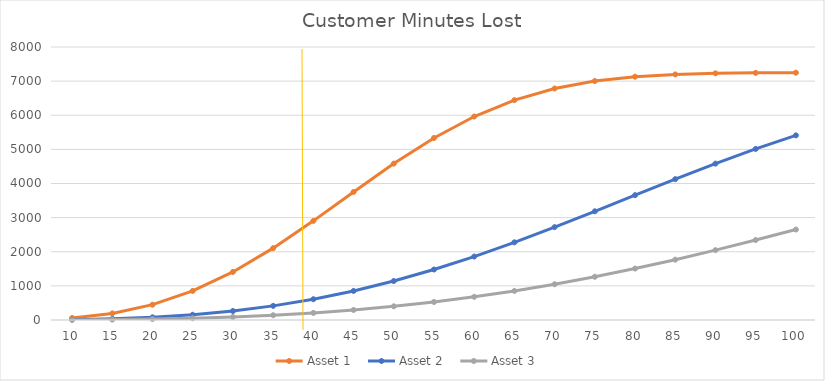
| Category | Asset 1 | Asset 2 | Asset 3 |
|---|---|---|---|
| 10.0 | 57.769 | 9.938 | 3.299 |
| 15.0 | 193.131 | 33.487 | 11.129 |
| 20.0 | 449.464 | 79.126 | 26.352 |
| 25.0 | 851.897 | 153.739 | 51.379 |
| 30.0 | 1408.419 | 263.607 | 88.554 |
| 35.0 | 2105.123 | 414.101 | 140.114 |
| 40.0 | 2905.106 | 609.349 | 208.151 |
| 45.0 | 3752.664 | 851.897 | 294.557 |
| 50.0 | 4582.874 | 1142.401 | 400.979 |
| 55.0 | 5334.456 | 1479.39 | 528.756 |
| 60.0 | 5962.115 | 1859.139 | 678.871 |
| 65.0 | 6444.264 | 2275.689 | 851.897 |
| 70.0 | 6783.734 | 2721.033 | 1047.952 |
| 75.0 | 7001.919 | 3185.471 | 1266.664 |
| 80.0 | 7129.367 | 3658.142 | 1507.145 |
| 85.0 | 7196.71 | 4127.667 | 1767.986 |
| 90.0 | 7228.742 | 4582.874 | 2047.26 |
| 95.0 | 7242.388 | 5013.518 | 2342.555 |
| 100.0 | 7247.568 | 5410.931 | 2651.016 |